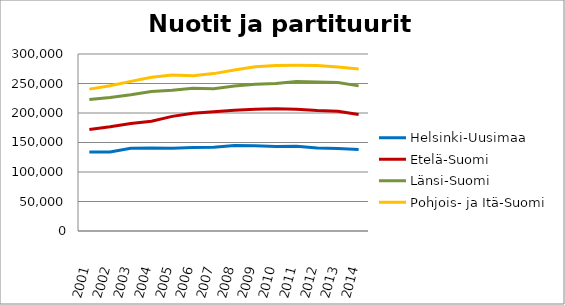
| Category | Helsinki-Uusimaa | Etelä-Suomi | Länsi-Suomi | Pohjois- ja Itä-Suomi |
|---|---|---|---|---|
| 2001.0 | 133886 | 172029 | 222834 | 240491 |
| 2002.0 | 133841 | 176601 | 226408 | 246046 |
| 2003.0 | 140303 | 182221 | 231095 | 253568 |
| 2004.0 | 140806 | 185920 | 236583 | 260635 |
| 2005.0 | 140243 | 194303 | 238384 | 264367 |
| 2006.0 | 141648 | 199472 | 241892 | 263077 |
| 2007.0 | 141975 | 202216 | 241221 | 266756 |
| 2008.0 | 144719 | 204790 | 245611 | 272787 |
| 2009.0 | 144327 | 206344 | 248920 | 278456 |
| 2010.0 | 143405 | 207097 | 249901 | 280590 |
| 2011.0 | 143530 | 206155 | 253315 | 280947 |
| 2012.0 | 140785 | 204054 | 252565 | 280634 |
| 2013.0 | 139783 | 203056 | 251597 | 278032 |
| 2014.0 | 138109 | 197369 | 245980 | 274561 |